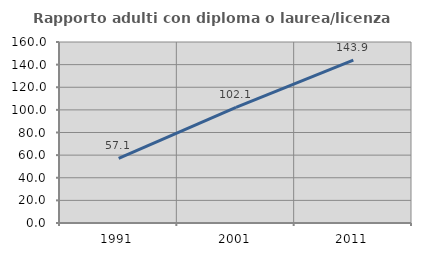
| Category | Rapporto adulti con diploma o laurea/licenza media  |
|---|---|
| 1991.0 | 57.051 |
| 2001.0 | 102.116 |
| 2011.0 | 143.889 |